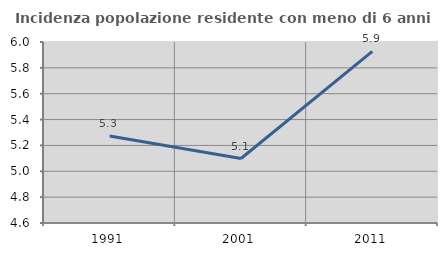
| Category | Incidenza popolazione residente con meno di 6 anni |
|---|---|
| 1991.0 | 5.274 |
| 2001.0 | 5.099 |
| 2011.0 | 5.928 |